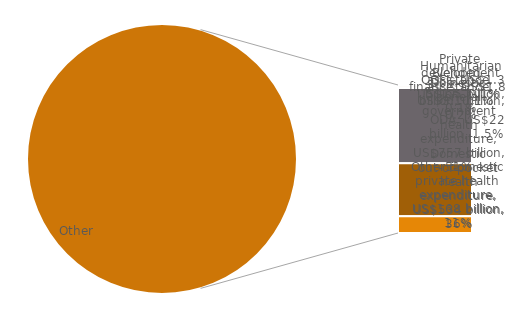
| Category | Series 0 |
|---|---|
| ODA, US$22 billion, 1.5% | 22.181 |
| Private development assistance, US$3.1 billion, 0.2% | 3.113 |
| OOFs, US$1.3 billion, 0.1% | 1.308 |
| Blended finance, US$1.8 billion, 0.1% | 1.818 |
| Humanitarian assistance, US$1.5 billion, 0.1% | 1.507 |
| Domestic general government health expenditure, US$757 billion, 51% | 757.198 |
| Domestic out-of-pocket health expenditure, US$534 billion, 36% | 533.576 |
| Other domestic private health expenditure, US$168 billion, 11% | 167.847 |